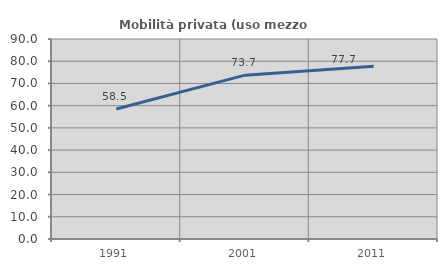
| Category | Mobilità privata (uso mezzo privato) |
|---|---|
| 1991.0 | 58.53 |
| 2001.0 | 73.729 |
| 2011.0 | 77.719 |